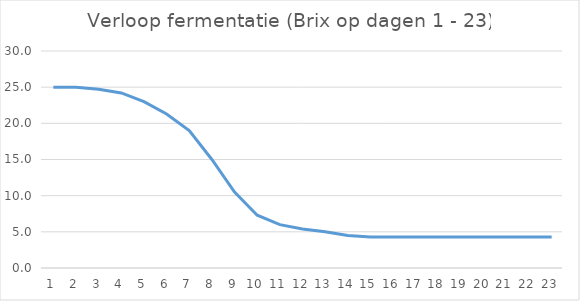
| Category | Series 0 |
|---|---|
| 0 | 25 |
| 1 | 25 |
| 2 | 24.7 |
| 3 | 24.2 |
| 4 | 23 |
| 5 | 21.3 |
| 6 | 19 |
| 7 | 15 |
| 8 | 10.5 |
| 9 | 7.3 |
| 10 | 6 |
| 11 | 5.4 |
| 12 | 5 |
| 13 | 4.5 |
| 14 | 4.3 |
| 15 | 4.3 |
| 16 | 4.3 |
| 17 | 4.3 |
| 18 | 4.3 |
| 19 | 4.3 |
| 20 | 4.3 |
| 21 | 4.3 |
| 22 | 4.3 |